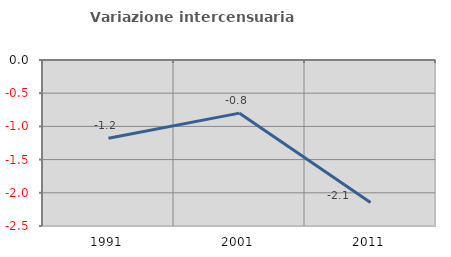
| Category | Variazione intercensuaria annua |
|---|---|
| 1991.0 | -1.178 |
| 2001.0 | -0.8 |
| 2011.0 | -2.146 |